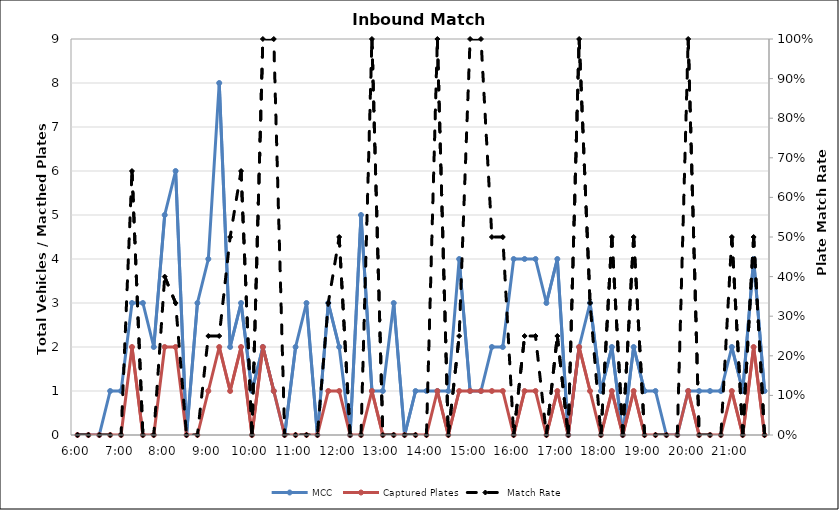
| Category | MCC | Captured Plates |
|---|---|---|
| 0.25 | 0 | 0 |
| 0.260416666666667 | 0 | 0 |
| 0.270833333333333 | 0 | 0 |
| 0.28125 | 1 | 0 |
| 0.291666666666667 | 1 | 0 |
| 0.302083333333333 | 3 | 2 |
| 0.3125 | 3 | 0 |
| 0.322916666666667 | 2 | 0 |
| 0.333333333333333 | 5 | 2 |
| 0.34375 | 6 | 2 |
| 0.354166666666667 | 0 | 0 |
| 0.364583333333333 | 3 | 0 |
| 0.375 | 4 | 1 |
| 0.385416666666667 | 8 | 2 |
| 0.395833333333333 | 2 | 1 |
| 0.40625 | 3 | 2 |
| 0.416666666666667 | 1 | 0 |
| 0.427083333333333 | 2 | 2 |
| 0.4375 | 1 | 1 |
| 0.447916666666667 | 0 | 0 |
| 0.458333333333333 | 2 | 0 |
| 0.46875 | 3 | 0 |
| 0.479166666666667 | 0 | 0 |
| 0.489583333333333 | 3 | 1 |
| 0.5 | 2 | 1 |
| 0.510416666666667 | 0 | 0 |
| 0.520833333333333 | 5 | 0 |
| 0.53125 | 1 | 1 |
| 0.541666666666667 | 1 | 0 |
| 0.552083333333333 | 3 | 0 |
| 0.5625 | 0 | 0 |
| 0.572916666666667 | 1 | 0 |
| 0.583333333333333 | 1 | 0 |
| 0.59375 | 1 | 1 |
| 0.604166666666667 | 1 | 0 |
| 0.614583333333333 | 4 | 1 |
| 0.625 | 1 | 1 |
| 0.635416666666667 | 1 | 1 |
| 0.645833333333333 | 2 | 1 |
| 0.65625 | 2 | 1 |
| 0.666666666666667 | 4 | 0 |
| 0.677083333333333 | 4 | 1 |
| 0.6875 | 4 | 1 |
| 0.697916666666667 | 3 | 0 |
| 0.708333333333333 | 4 | 1 |
| 0.71875 | 0 | 0 |
| 0.729166666666667 | 2 | 2 |
| 0.739583333333333 | 3 | 1 |
| 0.75 | 1 | 0 |
| 0.760416666666667 | 2 | 1 |
| 0.770833333333333 | 0 | 0 |
| 0.78125 | 2 | 1 |
| 0.791666666666667 | 1 | 0 |
| 0.802083333333333 | 1 | 0 |
| 0.8125 | 0 | 0 |
| 0.822916666666667 | 0 | 0 |
| 0.833333333333333 | 1 | 1 |
| 0.84375 | 1 | 0 |
| 0.854166666666667 | 1 | 0 |
| 0.864583333333333 | 1 | 0 |
| 0.875 | 2 | 1 |
| 0.885416666666667 | 1 | 0 |
| 0.895833333333333 | 4 | 2 |
| 0.90625 | 1 | 0 |